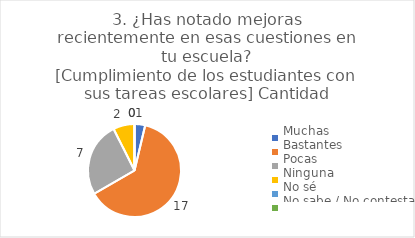
| Category | 3. ¿Has notado mejoras recientemente en esas cuestiones en tu escuela?
[Cumplimiento de los estudiantes con sus tareas escolares] |
|---|---|
| Muchas  | 0.037 |
| Bastantes  | 0.63 |
| Pocas  | 0.259 |
| Ninguna  | 0.074 |
| No sé  | 0 |
| No sabe / No contesta | 0 |